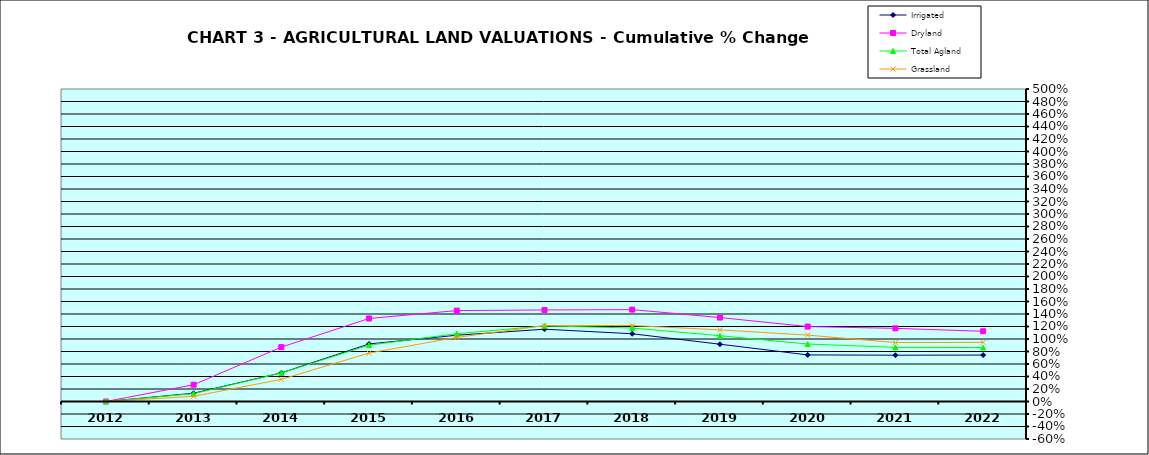
| Category | Irrigated | Dryland | Total Agland | Grassland |
|---|---|---|---|---|
| 2012.0 | 0 | 0 | 0 | 0 |
| 2013.0 | 0.132 | 0.268 | 0.126 | 0.083 |
| 2014.0 | 0.458 | 0.87 | 0.456 | 0.354 |
| 2015.0 | 0.921 | 1.328 | 0.901 | 0.775 |
| 2016.0 | 1.06 | 1.454 | 1.085 | 1.026 |
| 2017.0 | 1.157 | 1.465 | 1.21 | 1.214 |
| 2018.0 | 1.084 | 1.47 | 1.176 | 1.216 |
| 2019.0 | 0.917 | 1.343 | 1.052 | 1.146 |
| 2020.0 | 0.745 | 1.199 | 0.919 | 1.062 |
| 2021.0 | 0.741 | 1.17 | 0.866 | 0.943 |
| 2022.0 | 0.743 | 1.124 | 0.863 | 0.945 |